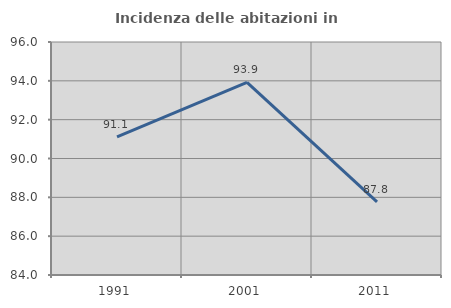
| Category | Incidenza delle abitazioni in proprietà  |
|---|---|
| 1991.0 | 91.111 |
| 2001.0 | 93.925 |
| 2011.0 | 87.766 |